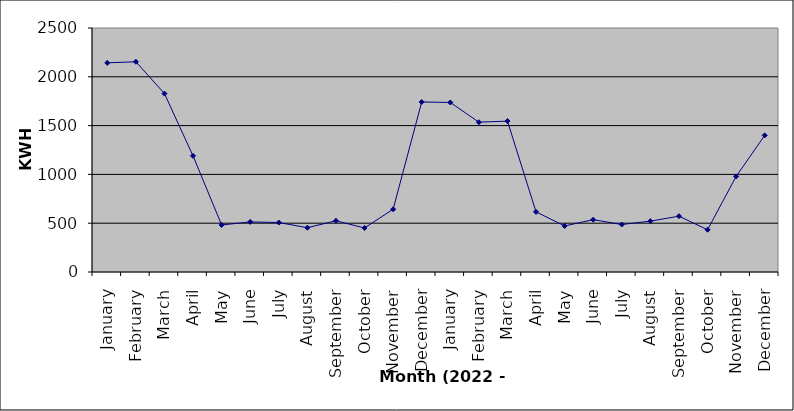
| Category | Series 0 |
|---|---|
| January | 2143 |
| February | 2154 |
| March | 1828 |
| April | 1190 |
| May | 482 |
| June | 513 |
| July | 507 |
| August | 454 |
| September | 525 |
| October | 451 |
| November | 643 |
| December | 1742 |
| January | 1737 |
| February | 1535 |
| March | 1546 |
| April | 616 |
| May | 472 |
| June | 536 |
| July | 487 |
| August | 521 |
| September | 572 |
| October | 433 |
| November | 979 |
| December | 1400 |